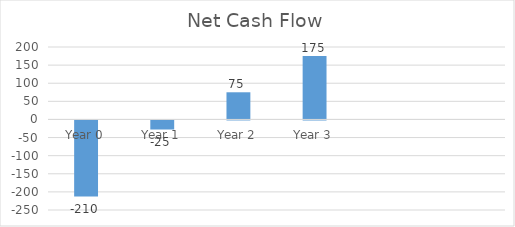
| Category | Series 0 |
|---|---|
| Year 0 | -210 |
| Year 1 | -25 |
| Year 2 | 75 |
| Year 3 | 175 |